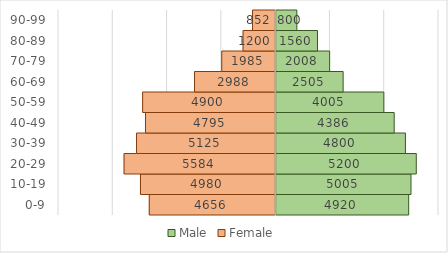
| Category | Male | Female |
|---|---|---|
| 0-9 | 4920 | -4656 |
| 10-19 | 5005 | -4980 |
| 20-29 | 5200 | -5584 |
| 30-39 | 4800 | -5125 |
| 40-49 | 4386 | -4795 |
| 50-59 | 4005 | -4900 |
| 60-69 | 2505 | -2988 |
| 70-79 | 2008 | -1985 |
| 80-89 | 1560 | -1200 |
| 90-99 | 800 | -852 |